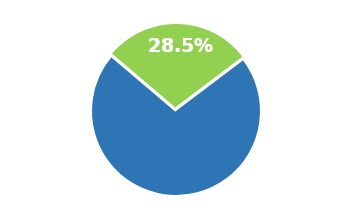
| Category | Series 0 |
|---|---|
| 0 | 0.715 |
| 1 | 0.285 |